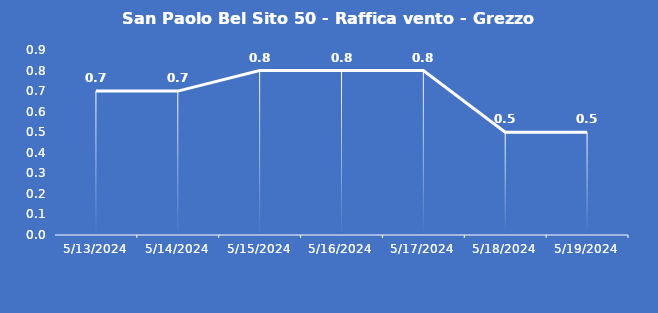
| Category | San Paolo Bel Sito 50 - Raffica vento - Grezzo (m/s) |
|---|---|
| 5/13/24 | 0.7 |
| 5/14/24 | 0.7 |
| 5/15/24 | 0.8 |
| 5/16/24 | 0.8 |
| 5/17/24 | 0.8 |
| 5/18/24 | 0.5 |
| 5/19/24 | 0.5 |